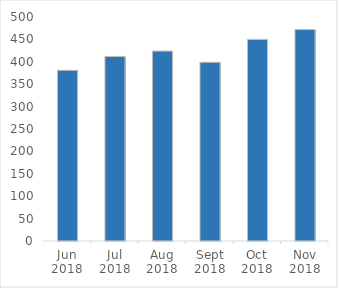
| Category | Series 0 |
|---|---|
| 2018-06-01 | 381 |
| 2018-07-01 | 412 |
| 2018-08-01 | 424 |
| 2018-09-01 | 399 |
| 2018-10-01 | 450 |
| 2018-11-01 | 472 |